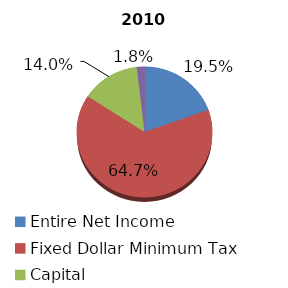
| Category | 2010 |
|---|---|
| Entire Net Income | 51649 |
| Fixed Dollar Minimum Tax | 170967 |
| Capital | 36977 |
| Alternative Minimum Taxable Income | 4799 |